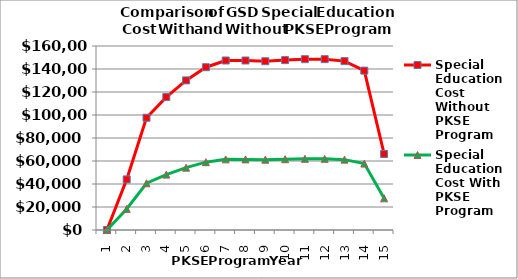
| Category | Special Education Cost Without PKSE Program | Special Education Cost With PKSE Program |
|---|---|---|
| 1.0 | 0 | 0 |
| 2.0 | 43993.834 | 18330.764 |
| 3.0 | 97617.631 | 40674.013 |
| 4.0 | 115573.024 | 48155.427 |
| 5.0 | 130091.289 | 54204.704 |
| 6.0 | 141542.806 | 58976.169 |
| 7.0 | 147394.415 | 61414.34 |
| 8.0 | 147386.721 | 61411.134 |
| 9.0 | 146761.385 | 61150.577 |
| 10.0 | 147722.028 | 61550.845 |
| 11.0 | 148542.097 | 61892.54 |
| 12.0 | 148560.89 | 61900.371 |
| 13.0 | 146843.51 | 61184.796 |
| 14.0 | 138596.95 | 57748.729 |
| 15.0 | 66125.925 | 27552.469 |